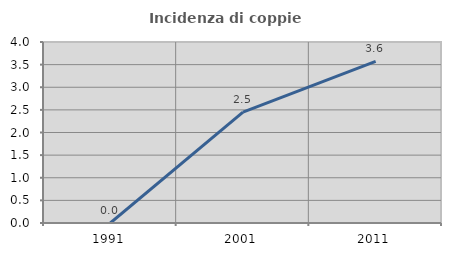
| Category | Incidenza di coppie miste |
|---|---|
| 1991.0 | 0 |
| 2001.0 | 2.451 |
| 2011.0 | 3.571 |